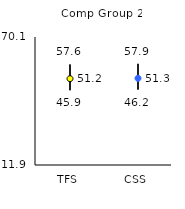
| Category | 25th | 75th | Mean |
|---|---|---|---|
| TFS | 45.9 | 57.6 | 51.15 |
| CSS | 46.2 | 57.9 | 51.33 |